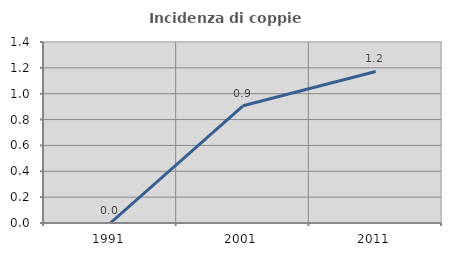
| Category | Incidenza di coppie miste |
|---|---|
| 1991.0 | 0 |
| 2001.0 | 0.906 |
| 2011.0 | 1.172 |